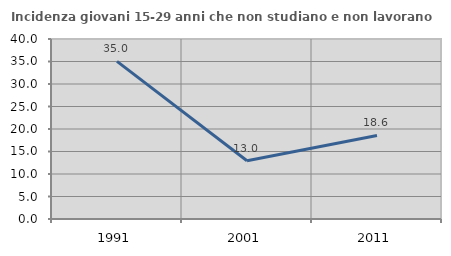
| Category | Incidenza giovani 15-29 anni che non studiano e non lavorano  |
|---|---|
| 1991.0 | 35.021 |
| 2001.0 | 12.955 |
| 2011.0 | 18.571 |